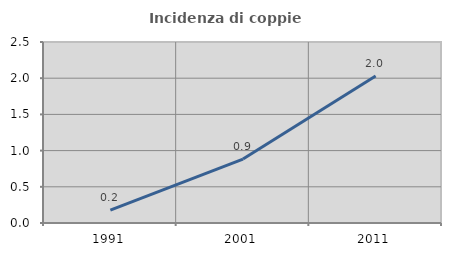
| Category | Incidenza di coppie miste |
|---|---|
| 1991.0 | 0.178 |
| 2001.0 | 0.883 |
| 2011.0 | 2.03 |